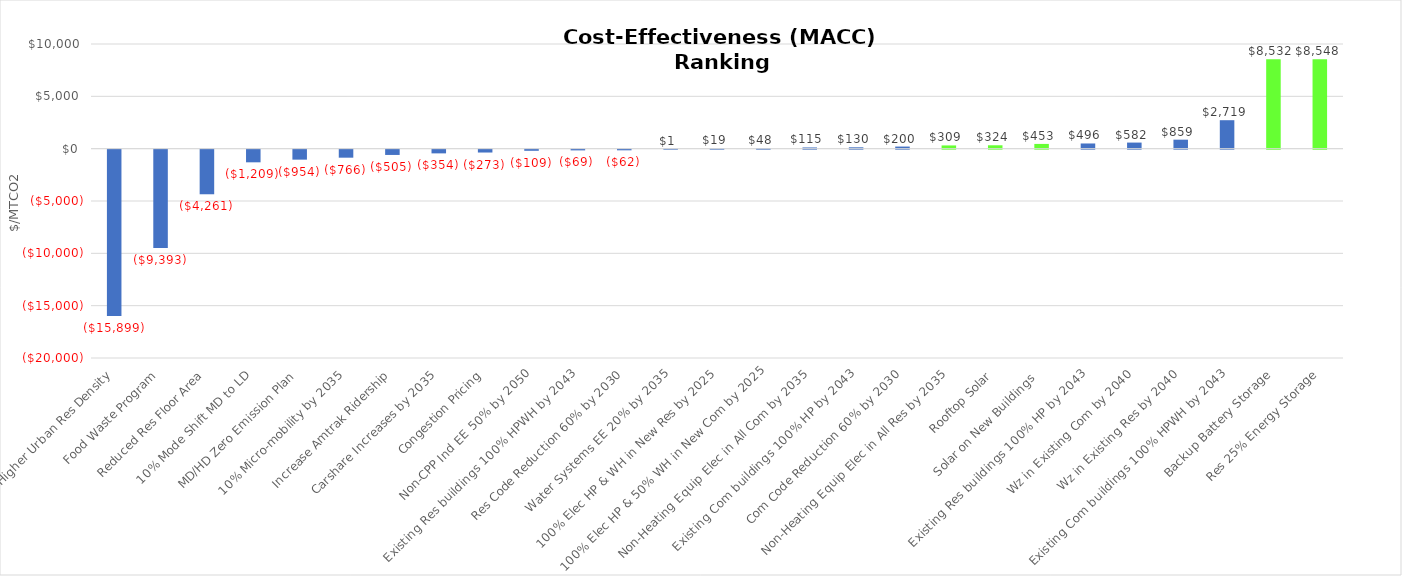
| Category | Series 0 |
|---|---|
| Higher Urban Res Density | -15898.512 |
| Food Waste Program | -9393 |
| Reduced Res Floor Area | -4261.302 |
| 10% Mode Shift MD to LD | -1208.946 |
| MD/HD Zero Emission Plan | -953.888 |
| 10% Micro-mobility by 2035 | -765.701 |
| Increase Amtrak Ridership | -504.985 |
| Carshare Increases by 2035 | -353.867 |
| Congestion Pricing | -272.995 |
| Non-CPP Ind EE 50% by 2050 | -109.028 |
| Existing Res buildings 100% HPWH by 2043 | -68.668 |
| Res Code Reduction 60% by 2030 | -62.073 |
| Water Systems EE 20% by 2035 | 0.73 |
| 100% Elec HP & WH in New Res by 2025 | 19.051 |
| 100% Elec HP & 50% WH in New Com by 2025 | 47.893 |
| Non-Heating Equip Elec in All Com by 2035 | 114.78 |
| Existing Com buildings 100% HP by 2043 | 129.961 |
| Com Code Reduction 60% by 2030 | 200.249 |
| Non-Heating Equip Elec in All Res by 2035 | 309.247 |
| Rooftop Solar | 323.77 |
| Solar on New Buildings  | 453.001 |
| Existing Res buildings 100% HP by 2043 | 496.359 |
| Wz in Existing Com by 2040 | 582.11 |
| Wz in Existing Res by 2040 | 858.86 |
| Existing Com buildings 100% HPWH by 2043 | 2719.258 |
| Backup Battery Storage | 8532.469 |
| Res 25% Energy Storage | 8548.112 |